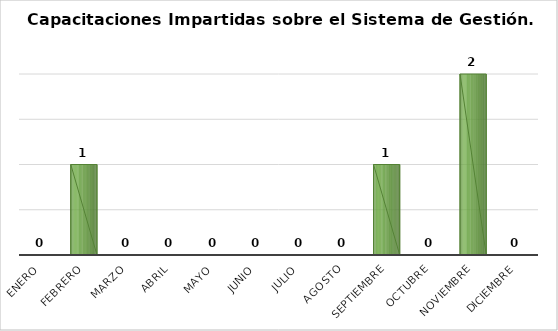
| Category | Capacitaciones impartidas/1 |
|---|---|
| Enero | 0 |
| Febrero | 1 |
| Marzo | 0 |
| Abril | 0 |
| Mayo | 0 |
| Junio | 0 |
| Julio | 0 |
| Agosto | 0 |
| Septiembre | 1 |
| Octubre | 0 |
| Noviembre | 2 |
| Diciembre | 0 |